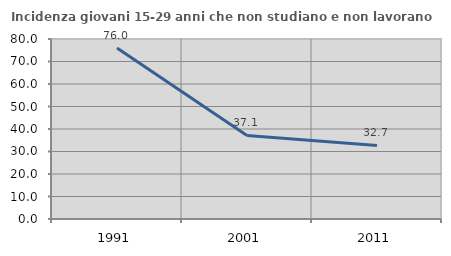
| Category | Incidenza giovani 15-29 anni che non studiano e non lavorano  |
|---|---|
| 1991.0 | 75.98 |
| 2001.0 | 37.147 |
| 2011.0 | 32.706 |